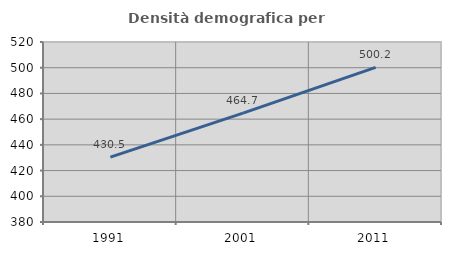
| Category | Densità demografica |
|---|---|
| 1991.0 | 430.503 |
| 2001.0 | 464.663 |
| 2011.0 | 500.246 |